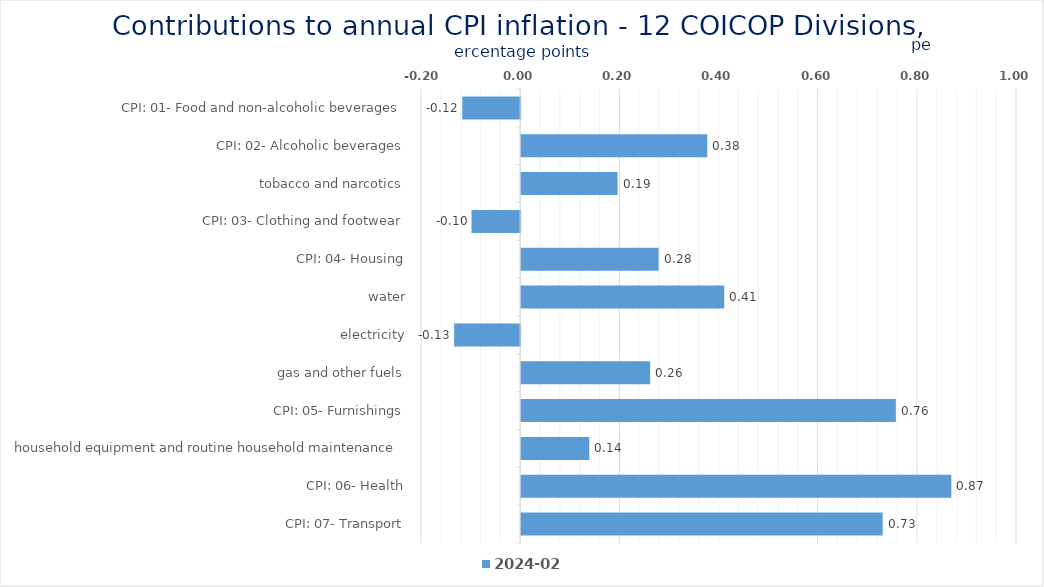
| Category | 2024-02 |
|---|---|
| CPI: 01- Food and non-alcoholic beverages | -0.117 |
| CPI: 02- Alcoholic beverages, tobacco and narcotics | 0.375 |
| CPI: 03- Clothing and footwear | 0.194 |
| CPI: 04- Housing, water, electricity, gas and other fuels | -0.098 |
| CPI: 05- Furnishings, household equipment and routine household maintenance | 0.277 |
| CPI: 06- Health | 0.409 |
| CPI: 07- Transport | -0.133 |
| CPI: 08- Communication | 0.26 |
| CPI: 09- Recreation and culture | 0.756 |
| CPI: 10- Education | 0.137 |
| CPI: 11- Restaurants and hotels | 0.868 |
| CPI: 12- Miscellaneous goods and services | 0.729 |